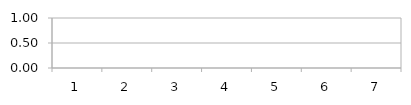
| Category | Gesamte Mannschaft |
|---|---|
| 0 | 0 |
| 1 | 0 |
| 2 | 0 |
| 3 | 0 |
| 4 | 0 |
| 5 | 0 |
| 6 | 0 |